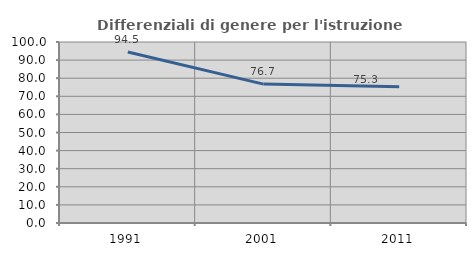
| Category | Differenziali di genere per l'istruzione superiore |
|---|---|
| 1991.0 | 94.507 |
| 2001.0 | 76.746 |
| 2011.0 | 75.289 |